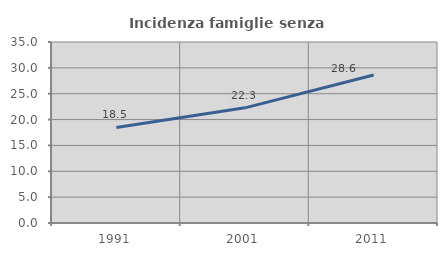
| Category | Incidenza famiglie senza nuclei |
|---|---|
| 1991.0 | 18.485 |
| 2001.0 | 22.268 |
| 2011.0 | 28.607 |